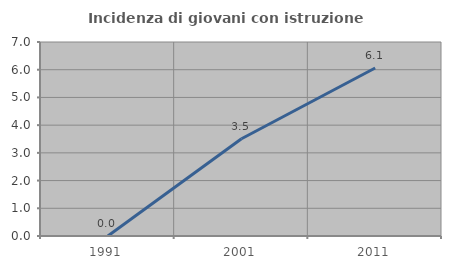
| Category | Incidenza di giovani con istruzione universitaria |
|---|---|
| 1991.0 | 0 |
| 2001.0 | 3.509 |
| 2011.0 | 6.061 |